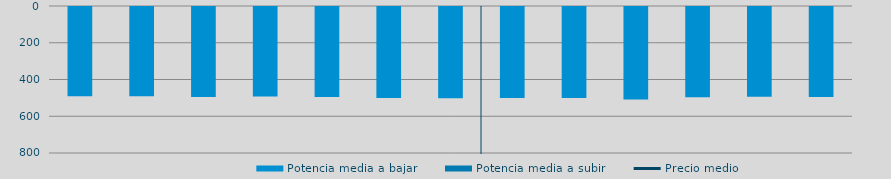
| Category | Potencia media a bajar | Potencia media a subir |
|---|---|---|
| 0 | 485.047 |  |
| 1 | 485.731 |  |
| 2 | 489.157 |  |
| 3 | 487.01 |  |
| 4 | 490.333 |  |
| 5 | 495.342 |  |
| 6 | 496.882 |  |
| 7 | 495.707 |  |
| 8 | 494.878 |  |
| 9 | 503.953 |  |
| 10 | 491.243 |  |
| 11 | 489.099 |  |
| 12 | 489.186 |  |